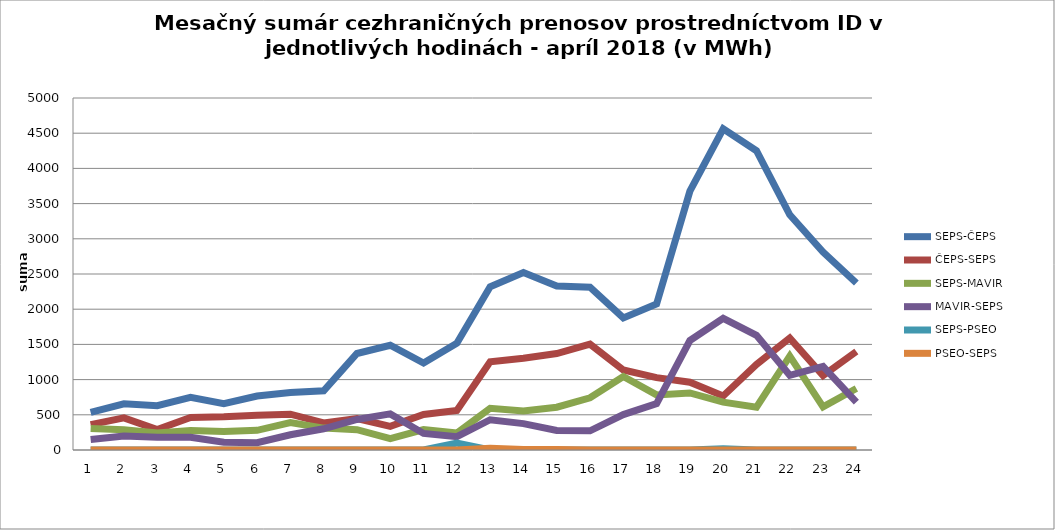
| Category | SEPS-ČEPS | ČEPS-SEPS | SEPS-MAVIR | MAVIR-SEPS | SEPS-PSEO | PSEO-SEPS |
|---|---|---|---|---|---|---|
| 1.0 | 533 | 361 | 306 | 149 | 0 | 0 |
| 2.0 | 656 | 457 | 289 | 199 | 0 | 0 |
| 3.0 | 629 | 290 | 242 | 182 | 0 | 0 |
| 4.0 | 749 | 462 | 277 | 181 | 0 | 0 |
| 5.0 | 657 | 473 | 263 | 111 | 0 | 0 |
| 6.0 | 766 | 495 | 279 | 104 | 0 | 0 |
| 7.0 | 817 | 509 | 389 | 217 | 0 | 0 |
| 8.0 | 841 | 384 | 311 | 301 | 0 | 0 |
| 9.0 | 1371 | 445 | 288 | 434 | 0 | 0 |
| 10.0 | 1488 | 336 | 160 | 513 | 0 | 0 |
| 11.0 | 1236 | 505 | 290 | 235 | 0 | 0 |
| 12.0 | 1517 | 562 | 240 | 189 | 100 | 0 |
| 13.0 | 2320 | 1253 | 593 | 430 | 0 | 24 |
| 14.0 | 2521 | 1303 | 554 | 375 | 0 | 7 |
| 15.0 | 2330 | 1370 | 608 | 277 | 0 | 7 |
| 16.0 | 2313 | 1503 | 742 | 273 | 0 | 0 |
| 17.0 | 1877 | 1137 | 1044 | 503 | 0 | 0 |
| 18.0 | 2074 | 1028 | 783 | 660 | 0 | 0 |
| 19.0 | 3677 | 963 | 810 | 1555 | 0 | 0 |
| 20.0 | 4563 | 767 | 680 | 1870 | 17 | 0 |
| 21.0 | 4251 | 1215 | 607 | 1629 | 0 | 0 |
| 22.0 | 3341 | 1590 | 1334 | 1061 | 0 | 0 |
| 23.0 | 2812 | 1057 | 612 | 1188 | 0 | 0 |
| 24.0 | 2373 | 1399 | 874 | 681 | 0 | 0 |